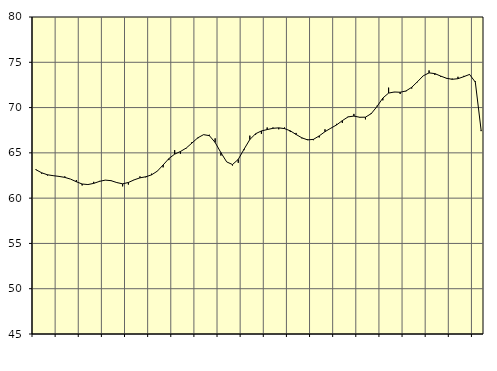
| Category | Piggar | Samtliga anställda (inkl. anställda utomlands) |
|---|---|---|
| nan | 63.2 | 63.14 |
| 1.0 | 62.7 | 62.8 |
| 1.0 | 62.5 | 62.58 |
| 1.0 | 62.5 | 62.48 |
| nan | 62.4 | 62.4 |
| 2.0 | 62.4 | 62.29 |
| 2.0 | 62.1 | 62.1 |
| 2.0 | 62 | 61.81 |
| nan | 61.4 | 61.56 |
| 3.0 | 61.5 | 61.5 |
| 3.0 | 61.8 | 61.63 |
| 3.0 | 61.9 | 61.85 |
| nan | 62 | 61.99 |
| 4.0 | 61.9 | 61.93 |
| 4.0 | 61.7 | 61.72 |
| 4.0 | 61.3 | 61.58 |
| nan | 61.5 | 61.73 |
| 5.0 | 62 | 62.02 |
| 5.0 | 62.4 | 62.24 |
| 5.0 | 62.3 | 62.36 |
| nan | 62.7 | 62.57 |
| 6.0 | 63 | 62.98 |
| 6.0 | 63.4 | 63.66 |
| 6.0 | 64.2 | 64.37 |
| nan | 65.3 | 64.86 |
| 7.0 | 64.9 | 65.15 |
| 7.0 | 65.5 | 65.53 |
| 7.0 | 66.2 | 66.09 |
| nan | 66.6 | 66.66 |
| 8.0 | 67 | 67.01 |
| 8.0 | 67 | 66.9 |
| 8.0 | 66.6 | 66.15 |
| nan | 64.7 | 65.02 |
| 9.0 | 64 | 64 |
| 9.0 | 63.6 | 63.71 |
| 9.0 | 63.9 | 64.28 |
| nan | 65.3 | 65.4 |
| 10.0 | 66.9 | 66.47 |
| 10.0 | 67 | 67.11 |
| 10.0 | 67.1 | 67.42 |
| nan | 67.8 | 67.57 |
| 11.0 | 67.8 | 67.71 |
| 11.0 | 67.6 | 67.76 |
| 11.0 | 67.8 | 67.68 |
| nan | 67.3 | 67.43 |
| 12.0 | 67.2 | 67.03 |
| 12.0 | 66.6 | 66.66 |
| 12.0 | 66.5 | 66.43 |
| nan | 66.4 | 66.49 |
| 13.0 | 66.7 | 66.87 |
| 13.0 | 67.6 | 67.34 |
| 13.0 | 67.7 | 67.72 |
| nan | 68.2 | 68.08 |
| 14.0 | 68.3 | 68.56 |
| 14.0 | 69 | 68.97 |
| 14.0 | 69.3 | 69.06 |
| nan | 68.9 | 68.93 |
| 15.0 | 68.7 | 68.94 |
| 15.0 | 69.4 | 69.33 |
| 15.0 | 70.2 | 70.12 |
| nan | 70.8 | 71.05 |
| 16.0 | 72.2 | 71.6 |
| 16.0 | 71.7 | 71.72 |
| 16.0 | 71.5 | 71.69 |
| nan | 71.8 | 71.83 |
| 17.0 | 72.1 | 72.24 |
| 17.0 | 72.8 | 72.86 |
| 17.0 | 73.5 | 73.51 |
| nan | 74.1 | 73.83 |
| 18.0 | 73.6 | 73.75 |
| 18.0 | 73.4 | 73.48 |
| 18.0 | 73.2 | 73.24 |
| nan | 73.2 | 73.12 |
| 19.0 | 73.4 | 73.19 |
| 19.0 | 73.5 | 73.41 |
| 19.0 | 73.7 | 73.66 |
| nan | 72.9 | 72.81 |
| 20.0 | 67.4 | 67.51 |